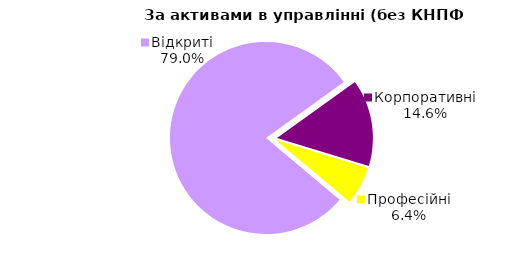
| Category | Series 0 |
|---|---|
| Відкриті | 2012.661 |
| Корпоративні | 372.823 |
| Професійні | 163.511 |